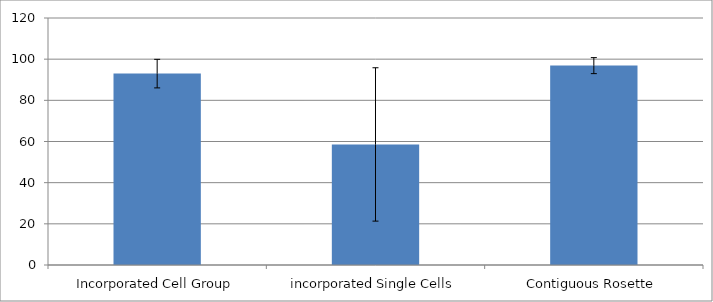
| Category | Series 0 |
|---|---|
| Incorporated Cell Group | 92.982 |
| incorporated Single Cells | 58.571 |
| Contiguous Rosette | 96.863 |